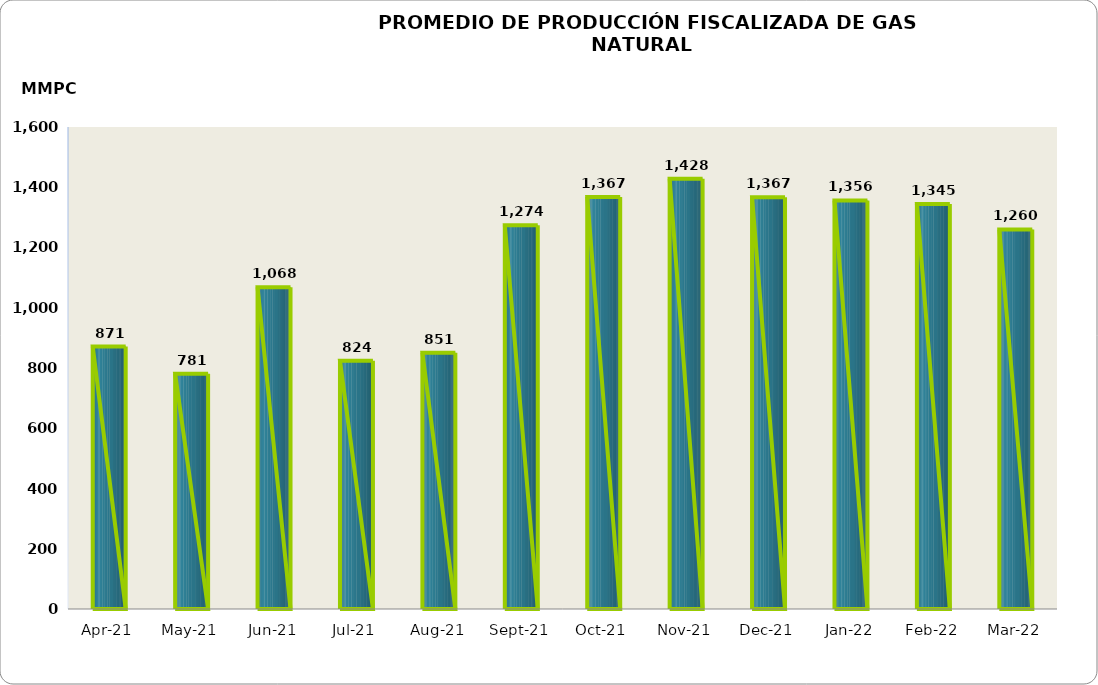
| Category | Series 0 |
|---|---|
| 2021-04-01 | 871274.072 |
| 2021-05-01 | 780865.314 |
| 2021-06-01 | 1068128.403 |
| 2021-07-01 | 823834.105 |
| 2021-08-01 | 850929.254 |
| 2021-09-01 | 1273570.561 |
| 2021-10-01 | 1367318.609 |
| 2021-11-01 | 1428097.616 |
| 2021-12-01 | 1366833.527 |
| 2022-01-01 | 1356402.082 |
| 2022-02-01 | 1344504.622 |
| 2022-03-01 | 1259914.198 |